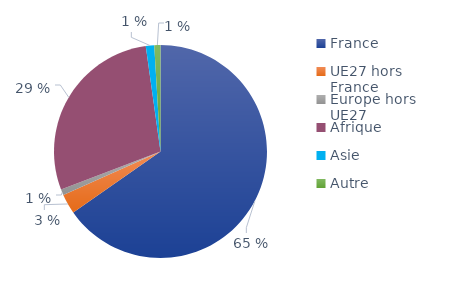
| Category | Series 0 |
|---|---|
| France | 0.653 |
| UE27 hors France | 0.03 |
| Europe hors UE27 | 0.009 |
| Afrique | 0.286 |
| Asie | 0.013 |
| Autre | 0.009 |